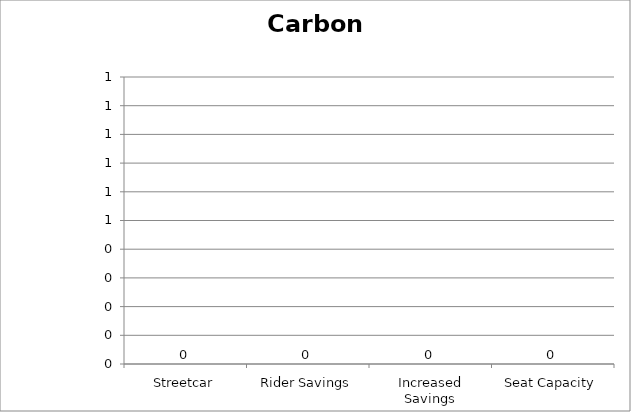
| Category | Carbon Monoxide |
|---|---|
| Streetcar | 0 |
| Rider Savings | 0 |
| Increased Savings | 0 |
| Seat Capacity | 0 |